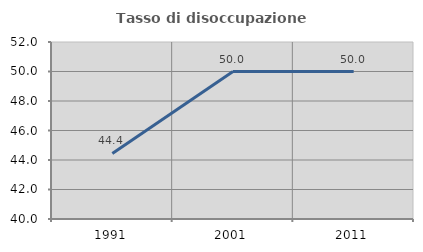
| Category | Tasso di disoccupazione giovanile  |
|---|---|
| 1991.0 | 44.444 |
| 2001.0 | 50 |
| 2011.0 | 50 |